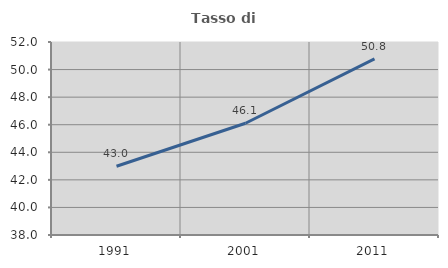
| Category | Tasso di occupazione   |
|---|---|
| 1991.0 | 42.988 |
| 2001.0 | 46.108 |
| 2011.0 | 50.769 |